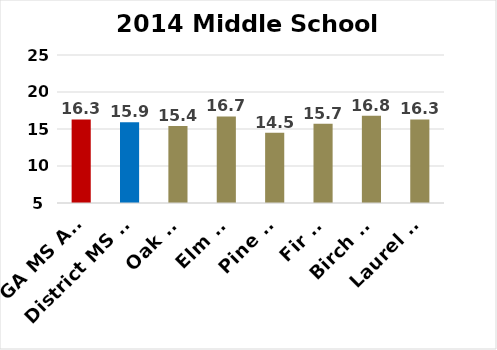
| Category | SGPs |
|---|---|
| GA MS Avg | 16.3 |
| District MS Avg | 15.9 |
| Oak MS | 15.4 |
| Elm MS | 16.7 |
| Pine MS | 14.5 |
| Fir MS | 15.7 |
| Birch MS | 16.8 |
| Laurel MS | 16.3 |